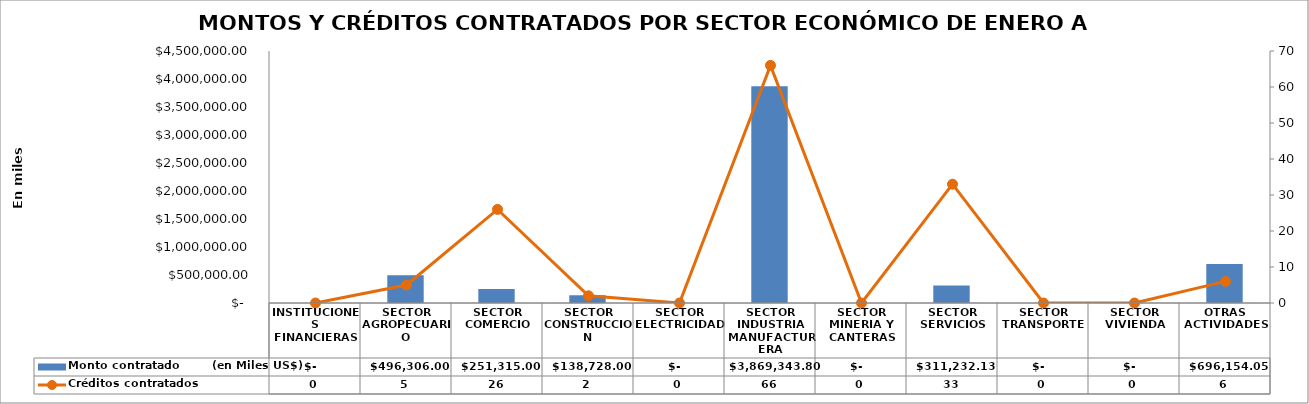
| Category | Monto contratado        (en Miles US$) |
|---|---|
| INSTITUCIONES FINANCIERAS | 0 |
| SECTOR AGROPECUARIO | 496306 |
| SECTOR COMERCIO | 251315 |
| SECTOR CONSTRUCCION | 138728 |
| SECTOR ELECTRICIDAD | 0 |
| SECTOR INDUSTRIA MANUFACTURERA | 3869343.8 |
| SECTOR MINERIA Y CANTERAS | 0 |
| SECTOR SERVICIOS | 311232.13 |
| SECTOR TRANSPORTE | 0 |
| SECTOR VIVIENDA | 0 |
| OTRAS ACTIVIDADES | 696154.05 |